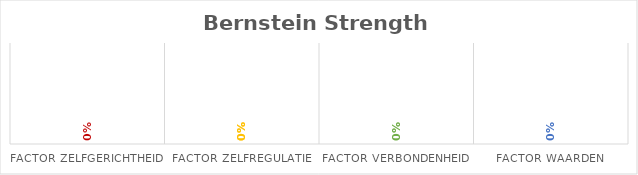
| Category | Series 0 |
|---|---|
| factor Zelfgerichtheid  | 0 |
| factor Zelfregulatie  | 0 |
| factor Verbondenheid  | 0 |
| factor Waarden  | 0 |